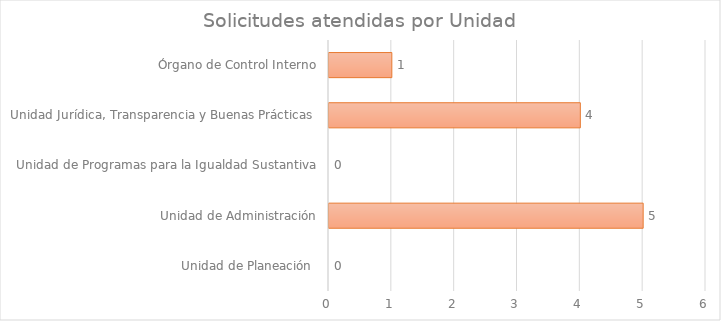
| Category | Series 1 |
|---|---|
| Unidad de Planeación  | 0 |
| Unidad de Administración | 5 |
| Unidad de Programas para la Igualdad Sustantiva | 0 |
| Unidad Jurídica, Transparencia y Buenas Prácticas  | 4 |
| Órgano de Control Interno | 1 |